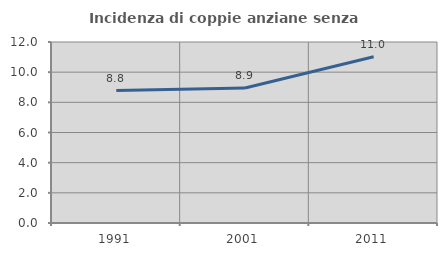
| Category | Incidenza di coppie anziane senza figli  |
|---|---|
| 1991.0 | 8.782 |
| 2001.0 | 8.948 |
| 2011.0 | 11.024 |